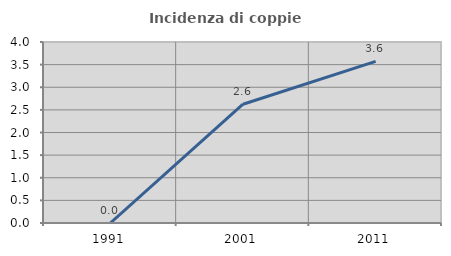
| Category | Incidenza di coppie miste |
|---|---|
| 1991.0 | 0 |
| 2001.0 | 2.625 |
| 2011.0 | 3.571 |